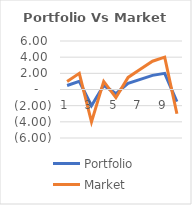
| Category | Portfolio | Market |
|---|---|---|
| 0 | 0.5 | 1 |
| 1 | 1 | 2 |
| 2 | -2 | -4 |
| 3 | 0.5 | 1 |
| 4 | -0.5 | -1 |
| 5 | 0.75 | 1.5 |
| 6 | 1.25 | 2.5 |
| 7 | 1.75 | 3.5 |
| 8 | 2 | 4 |
| 9 | -1.5 | -3 |